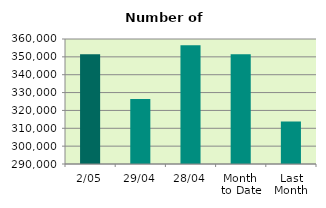
| Category | Series 0 |
|---|---|
| 2/05 | 351478 |
| 29/04 | 326424 |
| 28/04 | 356562 |
| Month 
to Date | 351478 |
| Last
Month | 313751.158 |